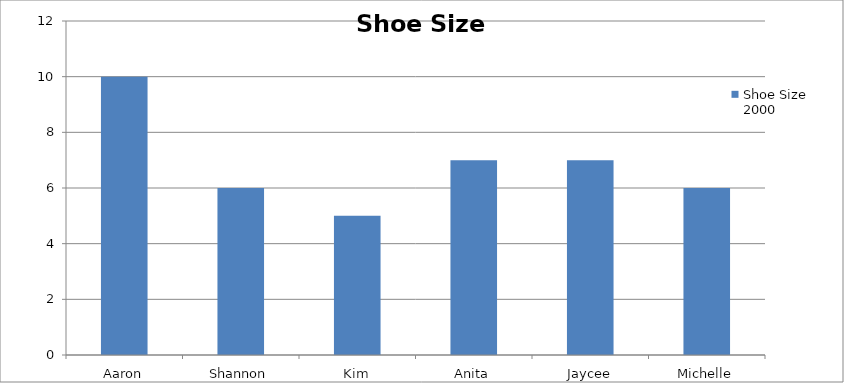
| Category | Shoe Size 2000 |
|---|---|
| Aaron | 10 |
| Shannon | 6 |
| Kim | 5 |
| Anita | 7 |
| Jaycee | 7 |
| Michelle | 6 |